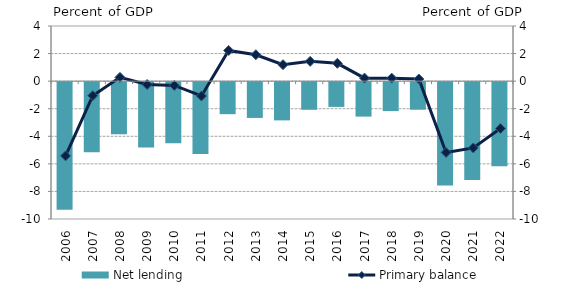
| Category | Net lending |
|---|---|
| 2006.0 | -9.257 |
| 2007.0 | -5.082 |
| 2008.0 | -3.781 |
| 2009.0 | -4.748 |
| 2010.0 | -4.425 |
| 2011.0 | -5.209 |
| 2012.0 | -2.324 |
| 2013.0 | -2.597 |
| 2014.0 | -2.774 |
| 2015.0 | -2.003 |
| 2016.0 | -1.796 |
| 2017.0 | -2.5 |
| 2018.0 | -2.1 |
| 2019.0 | -2 |
| 2020.0 | -7.5 |
| 2021.0 | -7.1 |
| 2022.0 | -6.1 |